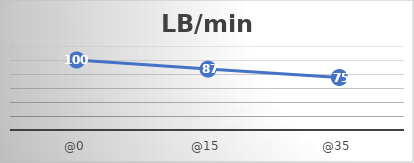
| Category | LB/min |
|---|---|
| @0 | 100 |
| @15 | 87 |
| @35 | 75 |